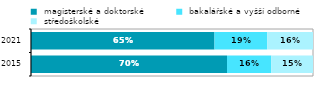
| Category |  magisterské a doktorské |  bakalářské a vyšší odborné |  středoškolské |
|---|---|---|---|
| 2015.0 | 0.695 | 0.157 | 0.148 |
| 2021.0 | 0.651 | 0.187 | 0.163 |